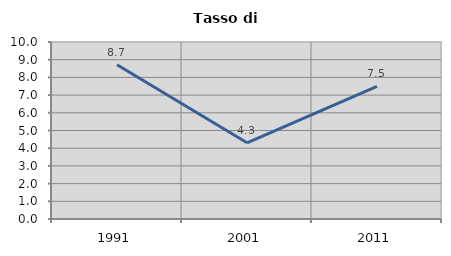
| Category | Tasso di disoccupazione   |
|---|---|
| 1991.0 | 8.713 |
| 2001.0 | 4.303 |
| 2011.0 | 7.489 |